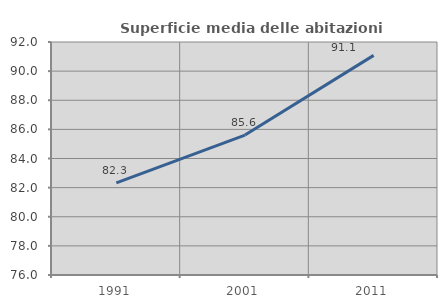
| Category | Superficie media delle abitazioni occupate |
|---|---|
| 1991.0 | 82.331 |
| 2001.0 | 85.611 |
| 2011.0 | 91.08 |